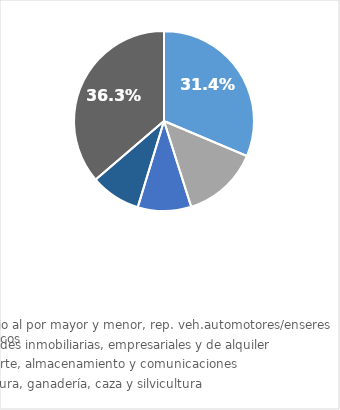
| Category | Series 0 |
|---|---|
| Comercio al por mayor y menor, rep. veh.automotores/enseres domésticos | 0.314 |
| Actividades inmobiliarias, empresariales y de alquiler | 0.137 |
| Transporte, almacenamiento y comunicaciones | 0.096 |
| Agricultura, ganadería, caza y silvicultura | 0.09 |
| Otros Rubros | 0.363 |